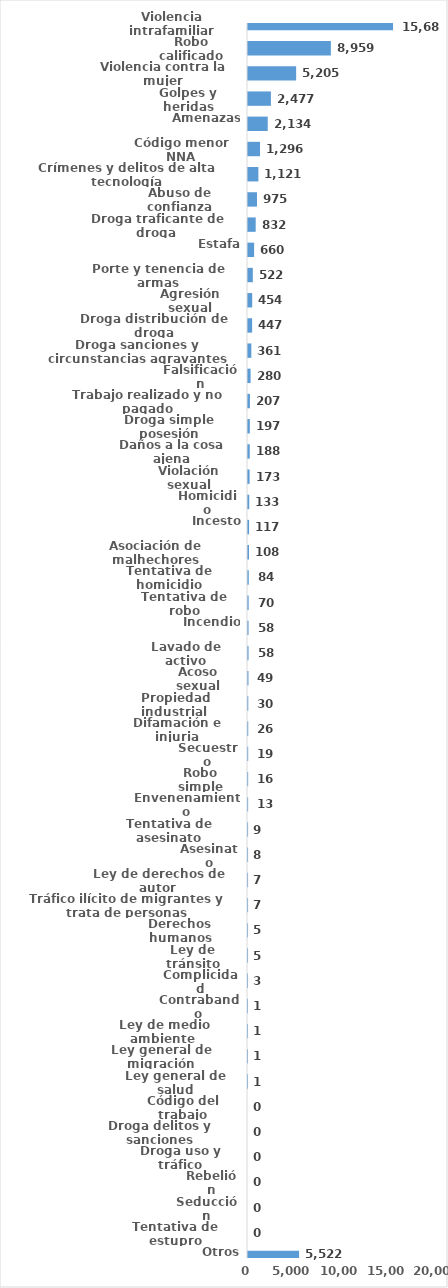
| Category | Series 0 |
|---|---|
| Violencia intrafamiliar | 15682 |
| Robo calificado | 8959 |
| Violencia contra la mujer | 5205 |
| Golpes y heridas | 2477 |
| Amenazas | 2134 |
| Código menor NNA | 1296 |
| Crímenes y delitos de alta tecnología | 1121 |
| Abuso de confianza | 975 |
| Droga traficante de droga  | 832 |
| Estafa | 660 |
| Porte y tenencia de armas | 522 |
| Agresión sexual | 454 |
| Droga distribución de droga | 447 |
| Droga sanciones y circunstancias agravantes | 361 |
| Falsificación | 280 |
| Trabajo realizado y no pagado | 207 |
| Droga simple posesión | 197 |
| Daños a la cosa ajena | 188 |
| Violación sexual | 173 |
| Homicidio | 133 |
| Incesto | 117 |
| Asociación de malhechores | 108 |
| Tentativa de homicidio | 84 |
| Tentativa de robo | 70 |
| Incendio | 58 |
| Lavado de activo | 58 |
| Acoso sexual | 49 |
| Propiedad industrial  | 30 |
| Difamación e injuria | 26 |
| Secuestro | 19 |
| Robo simple | 16 |
| Envenenamiento | 13 |
| Tentativa de asesinato | 9 |
| Asesinato | 8 |
| Ley de derechos de autor  | 7 |
| Tráfico ilícito de migrantes y trata de personas | 7 |
| Derechos humanos | 5 |
| Ley de tránsito | 5 |
| Complicidad | 3 |
| Contrabando | 1 |
| Ley de medio ambiente  | 1 |
| Ley general de migración | 1 |
| Ley general de salud | 1 |
| Código del trabajo | 0 |
| Droga delitos y sanciones | 0 |
| Droga uso y tráfico | 0 |
| Rebelión | 0 |
| Seducción | 0 |
| Tentativa de estupro | 0 |
| Otros | 5522 |